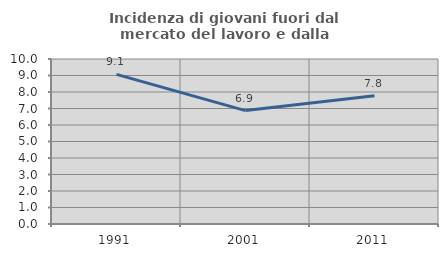
| Category | Incidenza di giovani fuori dal mercato del lavoro e dalla formazione  |
|---|---|
| 1991.0 | 9.071 |
| 2001.0 | 6.874 |
| 2011.0 | 7.773 |